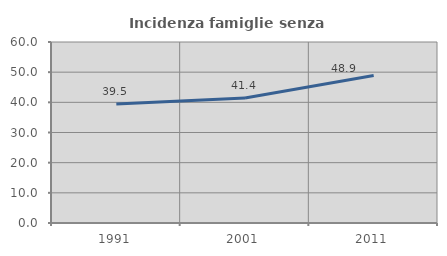
| Category | Incidenza famiglie senza nuclei |
|---|---|
| 1991.0 | 39.485 |
| 2001.0 | 41.406 |
| 2011.0 | 48.889 |